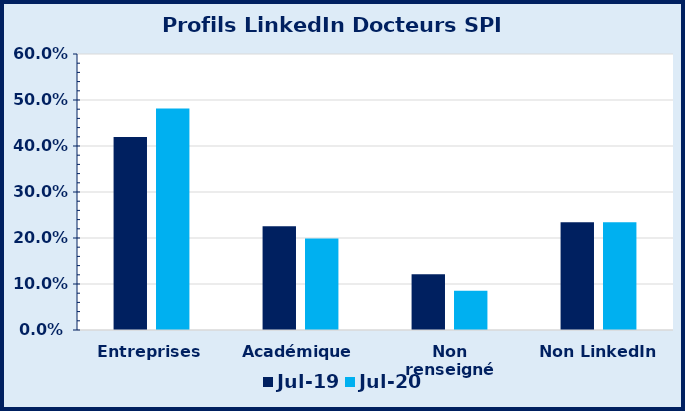
| Category | juil-19 | juil-20 |
|---|---|---|
| Entreprises | 0.419 | 0.481 |
| Académique | 0.225 | 0.199 |
| Non renseigné | 0.121 | 0.085 |
| Non LinkedIn | 0.234 | 0.234 |